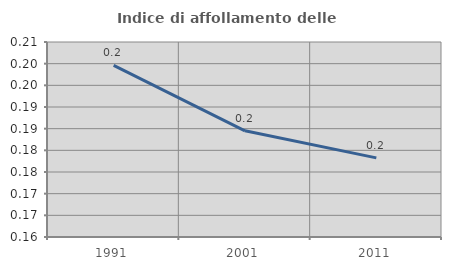
| Category | Indice di affollamento delle abitazioni  |
|---|---|
| 1991.0 | 0.2 |
| 2001.0 | 0.185 |
| 2011.0 | 0.178 |